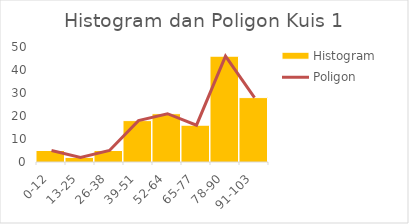
| Category | Histogram |
|---|---|
| 0-12 | 5 |
| 13-25 | 2 |
| 26-38 | 5 |
| 39-51 | 18 |
| 52-64 | 21 |
| 65-77 | 16 |
| 78-90 | 46 |
| 91-103 | 28 |